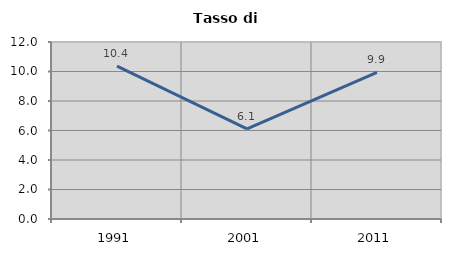
| Category | Tasso di disoccupazione   |
|---|---|
| 1991.0 | 10.366 |
| 2001.0 | 6.111 |
| 2011.0 | 9.945 |